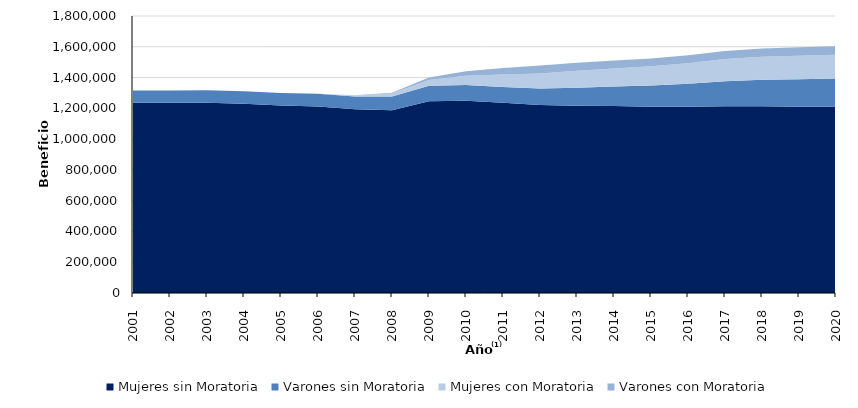
| Category | Mujeres sin Moratoria | Varones sin Moratoria | Mujeres con Moratoria | Varones con Moratoria |
|---|---|---|---|---|
| 2001.0 | 1236300.75 | 79422.5 | 0 | 0 |
| 2002.0 | 1236137.583 | 80285.25 | 0 | 0 |
| 2003.0 | 1236305 | 81416.583 | 0 | 0 |
| 2004.0 | 1229040.417 | 81633.667 | 0 | 0 |
| 2005.0 | 1218499.333 | 81326.5 | 0 | 0 |
| 2006.0 | 1212169.917 | 81822.083 | 348.833 | 97.583 |
| 2007.0 | 1194288.167 | 83336.333 | 6091.833 | 1252.75 |
| 2008.0 | 1187044.583 | 89282.833 | 19491.75 | 5318.5 |
| 2009.0 | 1246291.167 | 100034.917 | 38518.25 | 16236.583 |
| 2010.0 | 1248876.25 | 102017.833 | 60608.75 | 29916.333 |
| 2011.0 | 1236358.75 | 102900.583 | 80002.417 | 42327 |
| 2012.0 | 1222327.917 | 107030.667 | 97749.917 | 50776.083 |
| 2013.0 | 1217014.75 | 116951.75 | 109834.25 | 52733.25 |
| 2014.0 | 1214382.583 | 127530.167 | 117495.583 | 52190 |
| 2015.0 | 1211093.583 | 137964.917 | 123769.75 | 50916.167 |
| 2016.0 | 1210484.667 | 149147.333 | 133804.75 | 50823.75 |
| 2017.0 | 1214207.583 | 162135.333 | 144277.583 | 52378.583 |
| 2018.0 | 1213854.5 | 171511.917 | 149487.417 | 53645.5 |
| 2019.0 | 1210687.917 | 178537.25 | 152435.5 | 54513 |
| 2020.0 | 1209713.417 | 184892.083 | 153905.917 | 55006.75 |